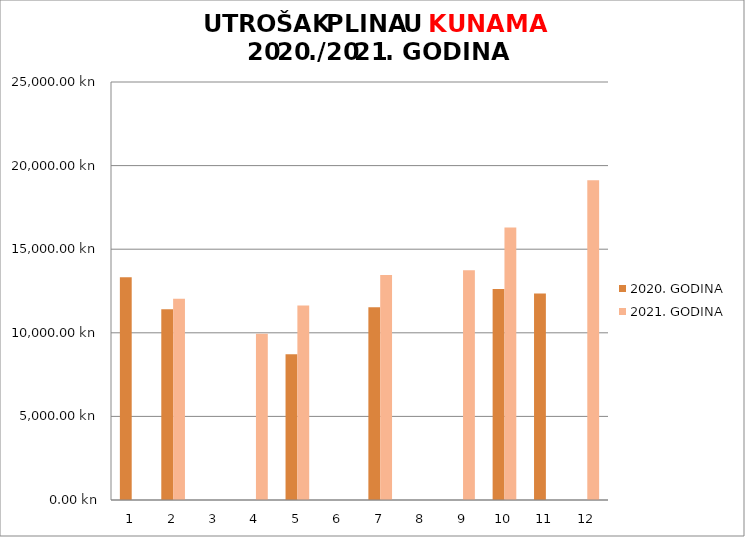
| Category | 2020. GODINA | 2021. GODINA |
|---|---|---|
| 0 | 13323.75 | 0 |
| 1 | 11404.01 | 12034.78 |
| 2 | 0 | 0 |
| 3 | 0 | 9936.39 |
| 4 | 8711.56 | 11640 |
| 5 | 0 | 0 |
| 6 | 11532.8 | 13460 |
| 7 | 0 | 0 |
| 8 | 0 | 13737.15 |
| 9 | 12622.5 | 16300 |
| 10 | 12349.95 | 0 |
| 11 | 0 | 19125 |